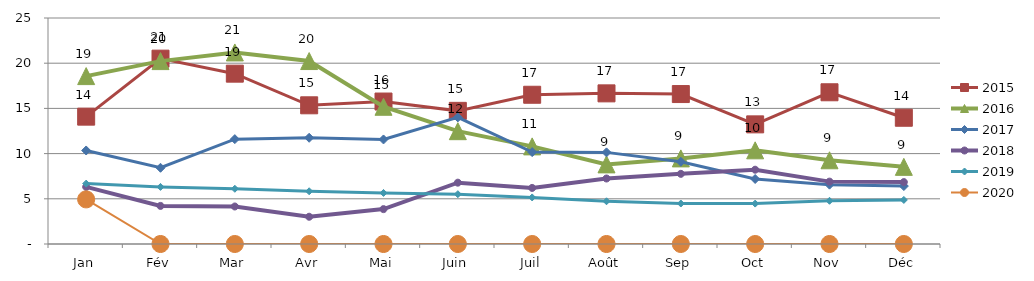
| Category | 2015 | 2016 | 2017 | 2018 | 2019 | 2020 |
|---|---|---|---|---|---|---|
| Jan | 14.088 | 18.573 | 10.345 | 6.315 | 6.68 | 4.936 |
| Fév | 20.504 | 20.232 | 8.433 | 4.213 | 6.315 | 0 |
| Mar | 18.842 | 21.188 | 11.601 | 4.15 | 6.109 | 0 |
| Avr | 15.342 | 20.238 | 11.751 | 3.014 | 5.832 | 0 |
| Mai | 15.76 | 15.18 | 11.565 | 3.859 | 5.648 | 0 |
| Juin | 14.728 | 12.479 | 14.003 | 6.784 | 5.512 | 0 |
| Juil | 16.51 | 10.799 | 10.166 | 6.203 | 5.152 | 0 |
| Août | 16.664 | 8.807 | 10.134 | 7.245 | 4.728 | 0 |
| Sep | 16.586 | 9.47 | 9.094 | 7.761 | 4.477 | 0 |
| Oct | 13.233 | 10.362 | 7.192 | 8.218 | 4.47 | 0 |
| Nov | 16.784 | 9.261 | 6.564 | 6.9 | 4.782 | 0 |
| Déc | 13.965 | 8.534 | 6.409 | 6.846 | 4.875 | 0 |